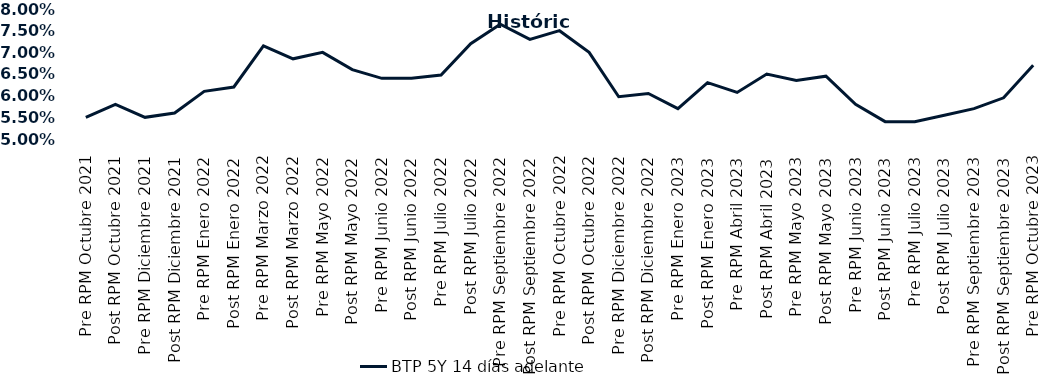
| Category | BTP 5Y 14 días adelante |
|---|---|
| Pre RPM Octubre 2021 | 0.055 |
| Post RPM Octubre 2021 | 0.058 |
| Pre RPM Diciembre 2021 | 0.055 |
| Post RPM Diciembre 2021 | 0.056 |
| Pre RPM Enero 2022 | 0.061 |
| Post RPM Enero 2022 | 0.062 |
| Pre RPM Marzo 2022 | 0.072 |
| Post RPM Marzo 2022 | 0.068 |
| Pre RPM Mayo 2022 | 0.07 |
| Post RPM Mayo 2022 | 0.066 |
| Pre RPM Junio 2022 | 0.064 |
| Post RPM Junio 2022 | 0.064 |
| Pre RPM Julio 2022 | 0.065 |
| Post RPM Julio 2022 | 0.072 |
| Pre RPM Septiembre 2022 | 0.076 |
| Post RPM Septiembre 2022 | 0.073 |
| Pre RPM Octubre 2022 | 0.075 |
| Post RPM Octubre 2022 | 0.07 |
| Pre RPM Diciembre 2022 | 0.06 |
| Post RPM Diciembre 2022 | 0.06 |
| Pre RPM Enero 2023 | 0.057 |
| Post RPM Enero 2023 | 0.063 |
| Pre RPM Abril 2023 | 0.061 |
| Post RPM Abril 2023 | 0.065 |
| Pre RPM Mayo 2023 | 0.064 |
| Post RPM Mayo 2023 | 0.064 |
| Pre RPM Junio 2023 | 0.058 |
| Post RPM Junio 2023 | 0.054 |
| Pre RPM Julio 2023 | 0.054 |
| Post RPM Julio 2023 | 0.056 |
| Pre RPM Septiembre 2023 | 0.057 |
| Post RPM Septiembre 2023 | 0.06 |
| Pre RPM Octubre 2023 | 0.067 |